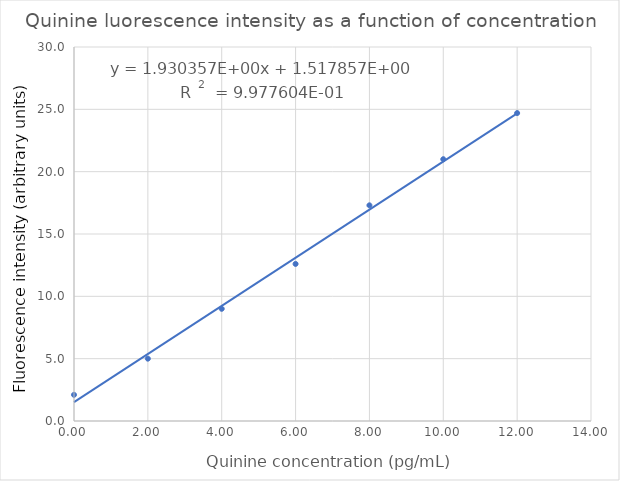
| Category | F (arbitrary units) |
|---|---|
| 0.0 | 2.1 |
| 2.0 | 5 |
| 4.0 | 9 |
| 6.0 | 12.6 |
| 8.0 | 17.3 |
| 10.0 | 21 |
| 12.0 | 24.7 |